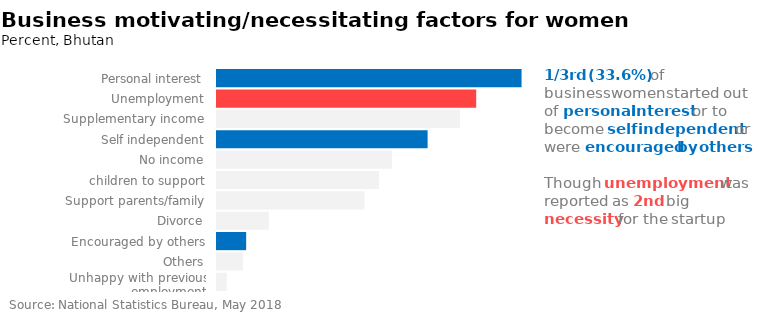
| Category | Percentage |
|---|---|
| Personal interest | 18.8 |
| Unemployment | 16 |
| Supplementary income | 15 |
| Self independent | 13 |
| No income | 10.8 |
| children to support | 10 |
| Support parents/family | 9.1 |
| Divorce | 3.2 |
| Encouraged by others | 1.8 |
| Others | 1.6 |
| Unhappy with previous employment | 0.6 |